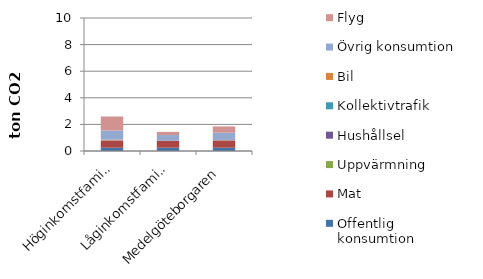
| Category | Offentlig konsumtion | Mat | Uppvärmning | Hushållsel | Kollektivtrafik | Bil | Övrig konsumtion | Flyg |
|---|---|---|---|---|---|---|---|---|
| Höginkomstfamilj | 0.25 | 0.507 | 0.002 | 0.03 | 0.006 | 0.055 | 0.69 | 1.053 |
| Låginkomstfamilj | 0.25 | 0.507 | 0.002 | 0.027 | 0.01 | 0 | 0.405 | 0.235 |
| Medelgöteborgaren | 0.25 | 0.507 | 0.002 | 0.036 | 0.003 | 0.031 | 0.547 | 0.47 |